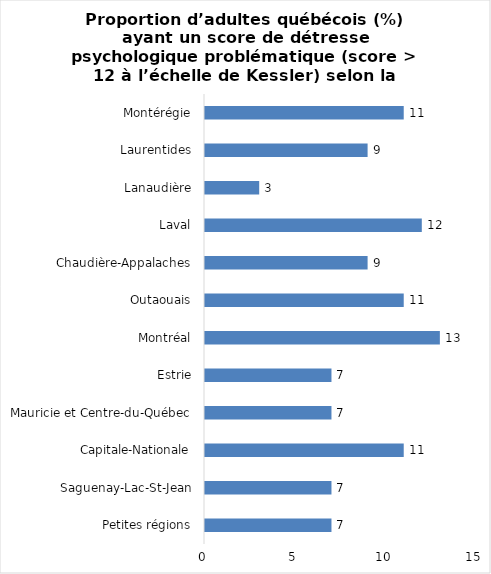
| Category | Series 0 |
|---|---|
| Petites régions | 7 |
| Saguenay-Lac-St-Jean | 7 |
| Capitale-Nationale | 11 |
| Mauricie et Centre-du-Québec | 7 |
| Estrie | 7 |
| Montréal | 13 |
| Outaouais | 11 |
| Chaudière-Appalaches | 9 |
| Laval | 12 |
| Lanaudière | 3 |
| Laurentides | 9 |
| Montérégie | 11 |